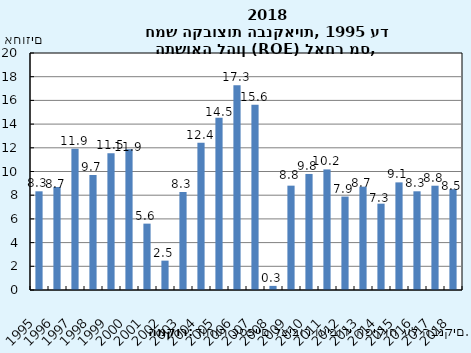
| Category | Series 0 |
|---|---|
| 1995 | 8.328 |
| 1996 | 8.691 |
| 1997 | 11.91 |
| 1998 | 9.706 |
| 1999 | 11.538 |
| 2000 | 11.888 |
| 2001 | 5.6 |
| 2002 | 2.477 |
| 2003 | 8.272 |
| 2004 | 12.433 |
| 2005 | 14.531 |
| 2006 | 17.273 |
| 2007 | 15.632 |
| 2008 | 0.347 |
| 2009 | 8.805 |
| 2010 | 9.793 |
| 2011 | 10.175 |
| 2012 | 7.883 |
| 2013 | 8.721 |
| 2014 | 7.285 |
| 2015 | 9.082 |
| 2016 | 8.329 |
| 2017 | 8.801 |
| 2018 | 8.507 |